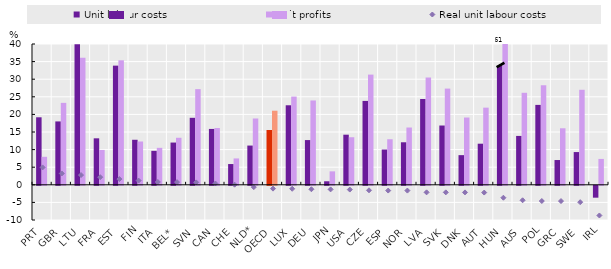
| Category | Unit labour costs | Unit profits |
|---|---|---|
| PRT | 19.181 | 7.953 |
| GBR | 18.005 | 23.279 |
| LTU | 39.9 | 36.075 |
| FRA | 13.206 | 9.9 |
| EST | 33.853 | 35.366 |
| FIN | 12.792 | 12.3 |
| ITA | 9.651 | 10.501 |
| BEL* | 12.003 | 13.361 |
| SVN | 19.031 | 27.177 |
| CAN | 15.869 | 16.137 |
| CHE | 5.896 | 7.49 |
| NLD* | 11.147 | 18.838 |
| OECD | 15.576 | 21.045 |
| LUX | 22.593 | 25.067 |
| DEU | 12.707 | 23.959 |
| JPN | 1.003 | 3.82 |
| USA | 14.237 | 13.516 |
| CZE | 23.831 | 31.305 |
| ESP | 10.021 | 12.941 |
| NOR | 12.082 | 16.273 |
| LVA | 24.37 | 30.481 |
| SVK | 16.842 | 27.333 |
| DNK | 8.426 | 19.111 |
| AUT | 11.676 | 21.916 |
| HUN | 33.829 | 61.382 |
| AUS | 13.884 | 26.135 |
| POL | 22.699 | 28.281 |
| GRC | 7.037 | 16.058 |
| SWE | 9.301 | 26.993 |
| IRL | -3.376 | 7.35 |